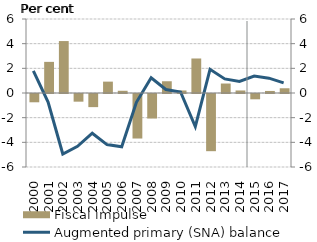
| Category | Fiscal impulse |
|---|---|
| 0 | -0.672 |
| 1900-01-01 | 2.524 |
| 1900-01-02 | 4.211 |
| 1900-01-03 | -0.622 |
| 1900-01-04 | -1.064 |
| 1900-01-05 | 0.922 |
| 1900-01-06 | 0.18 |
| 1900-01-07 | -3.61 |
| 1900-01-08 | -1.989 |
| 1900-01-09 | 0.952 |
| 1900-01-10 | 0.204 |
| 1900-01-11 | 2.798 |
| 1900-01-12 | -4.637 |
| 1900-01-13 | 0.768 |
| 1900-01-14 | 0.205 |
| 1900-01-15 | -0.43 |
| 1900-01-16 | 0.166 |
| 1900-01-17 | 0.384 |